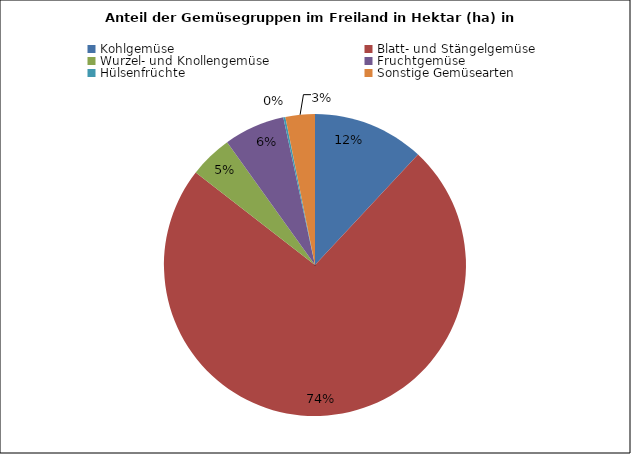
| Category | Series 1 | Series 0 |
|---|---|---|
| Kohlgemüse  | 53.2 | 39.9 |
| Blatt- und Stängelgemüse | 327.4 | 408.1 |
| Wurzel- und Knollengemüse | 20.5 | 23.2 |
| Fruchtgemüse | 29 | 34.7 |
| Hülsenfrüchte | 1 | 0.6 |
| Sonstige Gemüsearten | 14 | 12.6 |